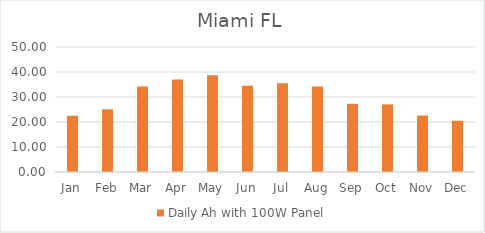
| Category | Daily Ah with 100W Panel |
|---|---|
| Jan | 22.506 |
| Feb | 25.062 |
| Mar | 34.243 |
| Apr | 36.973 |
| May | 38.71 |
| Jun | 34.491 |
| Jul | 35.484 |
| Aug | 34.243 |
| Sep | 27.295 |
| Oct | 27.047 |
| Nov | 22.581 |
| Dec | 20.496 |